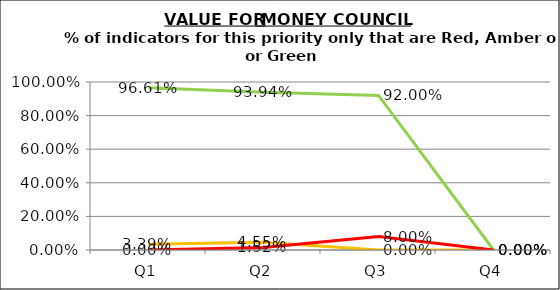
| Category | Green | Amber | Red |
|---|---|---|---|
| Q1 | 0.966 | 0.034 | 0 |
| Q2 | 0.939 | 0.045 | 0.015 |
| Q3 | 0.92 | 0 | 0.08 |
| Q4 | 0 | 0 | 0 |